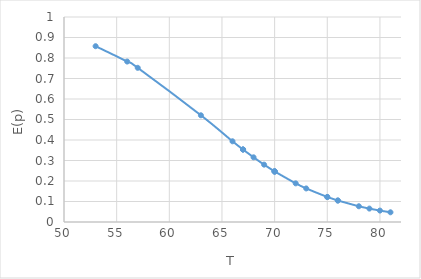
| Category | E(P) |
|---|---|
| 53.0 | 0.858 |
| 56.0 | 0.783 |
| 57.0 | 0.752 |
| 63.0 | 0.521 |
| 66.0 | 0.394 |
| 67.0 | 0.354 |
| 67.0 | 0.354 |
| 67.0 | 0.354 |
| 68.0 | 0.316 |
| 69.0 | 0.28 |
| 70.0 | 0.247 |
| 70.0 | 0.247 |
| 70.0 | 0.247 |
| 70.0 | 0.247 |
| 72.0 | 0.189 |
| 73.0 | 0.164 |
| 75.0 | 0.122 |
| 75.0 | 0.122 |
| 76.0 | 0.105 |
| 76.0 | 0.105 |
| 78.0 | 0.077 |
| 79.0 | 0.065 |
| 80.0 | 0.056 |
| 81.0 | 0.047 |